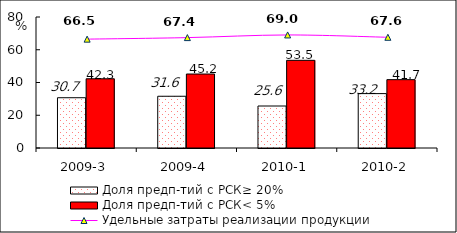
| Category | Доля предп-тий с РСК≥ 20% | Доля предп-тий с РСК< 5% |
|---|---|---|
| 2009-3 | 30.697 | 42.269 |
| 2009-4 | 31.598 | 45.172 |
| 2010-1 | 25.646 | 53.542 |
| 2010-2 | 33.222 | 41.738 |